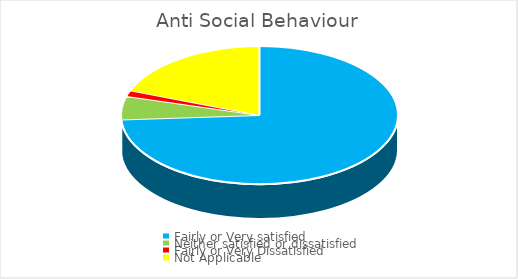
| Category | Series 0 |
|---|---|
| Fairly or Very satisfied | 73.97 |
| Neither satisfied or dissatisfied | 5.48 |
| Fairly or Very Dissatisfied | 1.37 |
| Not Applicable | 19.18 |